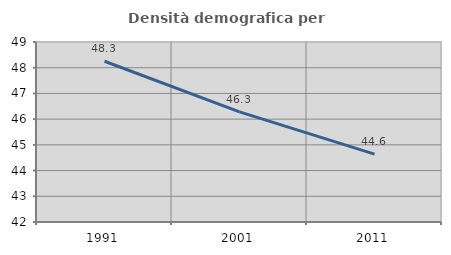
| Category | Densità demografica |
|---|---|
| 1991.0 | 48.252 |
| 2001.0 | 46.281 |
| 2011.0 | 44.638 |